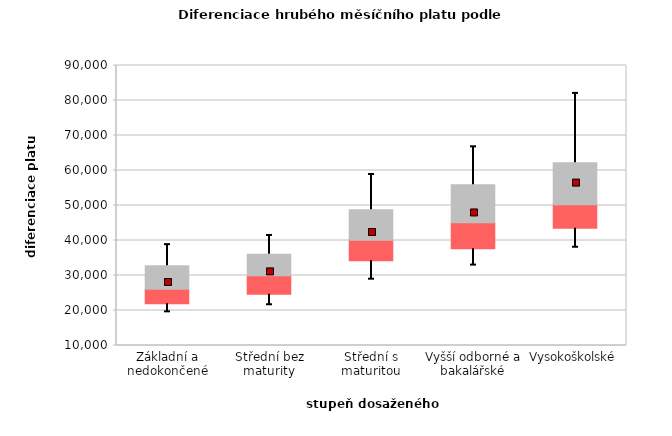
| Category | 0.25 | 0.5 | 0.75 |
|---|---|---|---|
| Základní a nedokončené | 21946.667 | 4151.333 | 6718.798 |
| Střední bez maturity | 24676.946 | 5286.81 | 6102.508 |
| Střední s maturitou | 34213.955 | 5836.448 | 8724.804 |
| Vyšší odborné a bakalářské | 37622.978 | 7475.126 | 10862.244 |
| Vysokoškolské | 43514.042 | 6721.016 | 11980.143 |